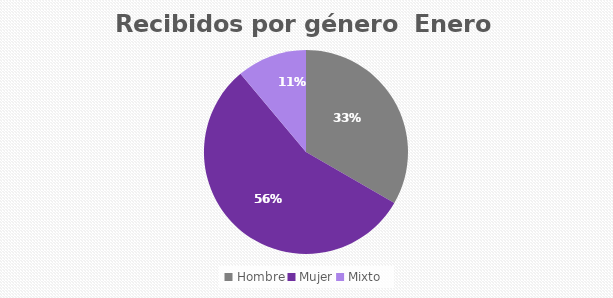
| Category | Recibidos por género  ENERO |
|---|---|
| Hombre | 3 |
| Mujer | 5 |
| Mixto | 1 |